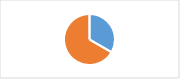
| Category | Section 1 : Objectifs et pilotage de la LAV |
|---|---|
| 0 | 0.333 |
| 1 | 0.667 |